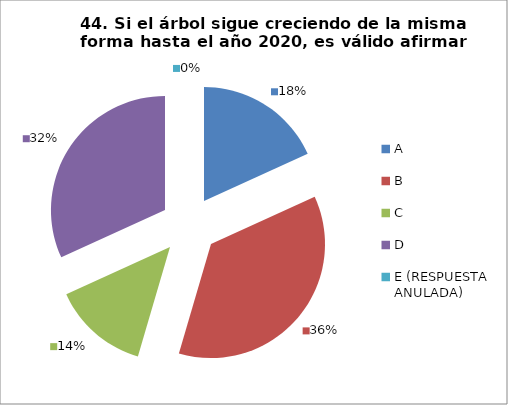
| Category | CANTIDAD DE RESPUESTAS PREGUNTA (44) | PORCENTAJE |
|---|---|---|
| A | 4 | 0.182 |
| B | 8 | 0.364 |
| C | 3 | 0.136 |
| D | 7 | 0.318 |
| E (RESPUESTA ANULADA) | 0 | 0 |